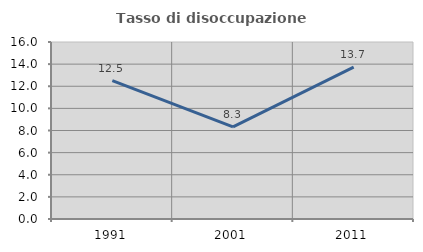
| Category | Tasso di disoccupazione giovanile  |
|---|---|
| 1991.0 | 12.5 |
| 2001.0 | 8.333 |
| 2011.0 | 13.725 |